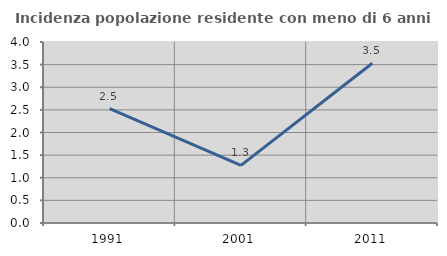
| Category | Incidenza popolazione residente con meno di 6 anni |
|---|---|
| 1991.0 | 2.525 |
| 2001.0 | 1.274 |
| 2011.0 | 3.529 |